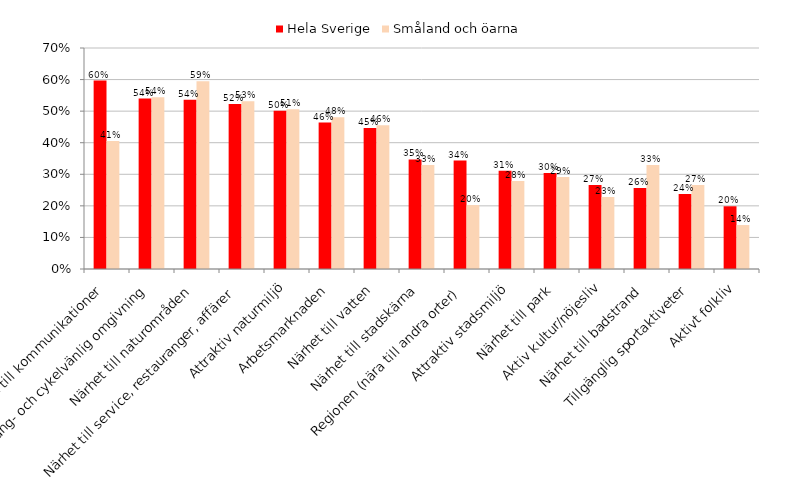
| Category | Hela Sverige | Småland och öarna |
|---|---|---|
| Närhet till kommunikationer | 0.597 | 0.405 |
| Gång- och cykelvänlig omgivning | 0.54 | 0.544 |
| Närhet till naturområden | 0.536 | 0.595 |
| Närhet till service, restauranger, affärer | 0.523 | 0.532 |
| Attraktiv naturmiljö | 0.501 | 0.506 |
| Arbetsmarknaden | 0.464 | 0.481 |
| Närhet till vatten | 0.446 | 0.456 |
| Närhet till stadskärna | 0.347 | 0.329 |
| Regionen (nära till andra orter) | 0.343 | 0.203 |
|  Attraktiv stadsmiljö | 0.311 | 0.278 |
| Närhet till park | 0.304 | 0.291 |
| Aktiv kultur/nöjesliv | 0.266 | 0.228 |
| Närhet till badstrand | 0.257 | 0.329 |
| Tillgänglig sportaktiveter | 0.237 | 0.266 |
| Aktivt folkliv | 0.199 | 0.139 |